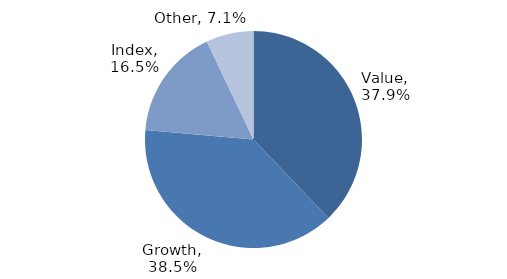
| Category | Investment Style |
|---|---|
| Value | 0.379 |
| Growth | 0.385 |
| Index | 0.165 |
| Other | 0.071 |